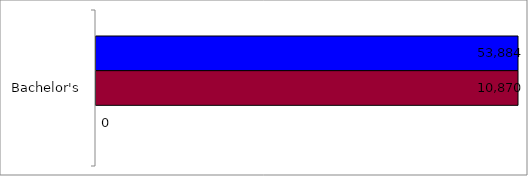
| Category | 50 states and D.C. | SREB states | State |
|---|---|---|---|
| Bachelor's | 53884 | 10870 | 0 |